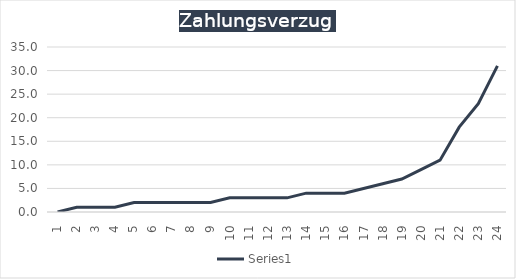
| Category | Series 1 |
|---|---|
| 1.0 | 0 |
| 2.0 | 1 |
| 3.0 | 1 |
| 4.0 | 1 |
| 5.0 | 2 |
| 6.0 | 2 |
| 7.0 | 2 |
| 8.0 | 2 |
| 9.0 | 2 |
| 10.0 | 3 |
| 11.0 | 3 |
| 12.0 | 3 |
| 13.0 | 3 |
| 14.0 | 4 |
| 15.0 | 4 |
| 16.0 | 4 |
| 17.0 | 5 |
| 18.0 | 6 |
| 19.0 | 7 |
| 20.0 | 9 |
| 21.0 | 11 |
| 22.0 | 18 |
| 23.0 | 23 |
| 24.0 | 31 |